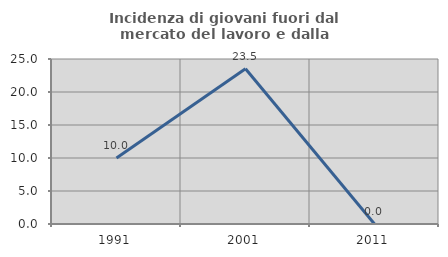
| Category | Incidenza di giovani fuori dal mercato del lavoro e dalla formazione  |
|---|---|
| 1991.0 | 10 |
| 2001.0 | 23.529 |
| 2011.0 | 0 |